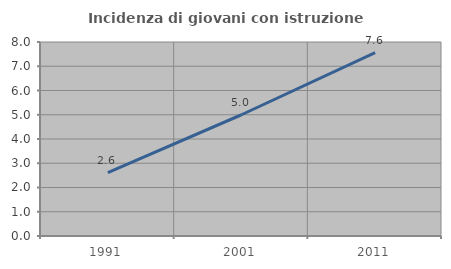
| Category | Incidenza di giovani con istruzione universitaria |
|---|---|
| 1991.0 | 2.609 |
| 2001.0 | 5 |
| 2011.0 | 7.563 |